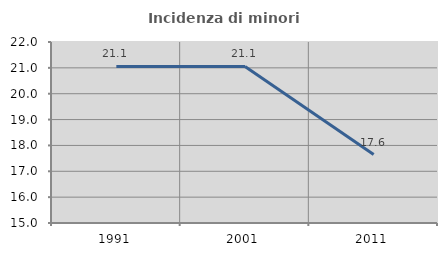
| Category | Incidenza di minori stranieri |
|---|---|
| 1991.0 | 21.053 |
| 2001.0 | 21.053 |
| 2011.0 | 17.647 |